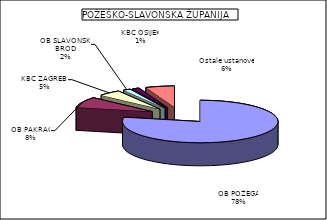
| Category | Series 0 |
|---|---|
| OB POŽEGA | 78.291 |
| OB PAKRAC | 8.08 |
| KBC ZAGREB  | 4.699 |
| OB SLAVONSKI BROD | 1.527 |
| KBC OSIJEK | 1.399 |
| Ostale ustanove | 6.003 |